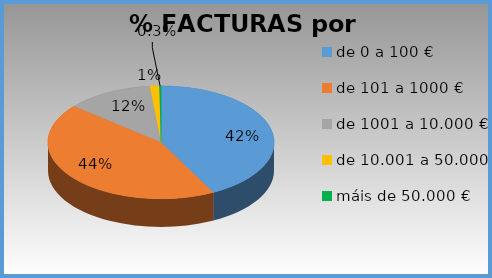
| Category | % Facturas |
|---|---|
| de 0 a 100 € | 0.424 |
| de 101 a 1000 € | 0.437 |
| de 1001 a 10.000 € | 0.124 |
| de 10.001 a 50.000 € | 0.013 |
| máis de 50.000 € | 0.003 |